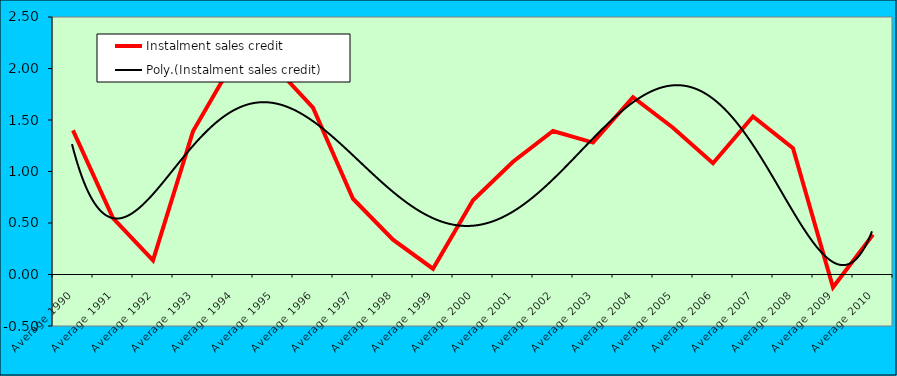
| Category | Instalment sales credit |
|---|---|
| Average 1990 | 1.399 |
| Average 1991 | 0.547 |
| Average 1992 | 0.138 |
| Average 1993 | 1.39 |
| Average 1994 | 2.061 |
| Average 1995 | 2.036 |
| Average 1996 | 1.619 |
| Average 1997 | 0.735 |
| Average 1998 | 0.338 |
| Average 1999 | 0.056 |
| Average 2000 | 0.72 |
| Average 2001 | 1.095 |
| Average 2002 | 1.394 |
| Average 2003 | 1.281 |
| Average 2004 | 1.721 |
| Average 2005 | 1.425 |
| Average 2006 | 1.08 |
| Average 2007 | 1.535 |
| Average 2008 | 1.227 |
| Average 2009 | -0.124 |
| Average 2010 | 0.387 |